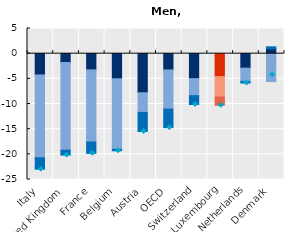
| Category | Hours per at work employees | 0 hours employment | Joblessness (net of population change) |
|---|---|---|---|
| Italy | -4.226 | -16.46 | -2.274 |
| United Kingdom | -1.77 | -17.406 | -0.972 |
| France | -3.219 | -14.33 | -2.248 |
| Belgium | -4.992 | -14.014 | -0.289 |
| Austria | -7.768 | -3.902 | -3.79 |
| OECD | -3.231 | -7.772 | -3.69 |
| Switzerland | -4.955 | -3.393 | -1.753 |
| Luxembourg | -4.551 | -4.064 | -1.657 |
| Netherlands | -2.879 | -2.631 | -0.325 |
| Denmark | 0.953 | -5.547 | 0.407 |